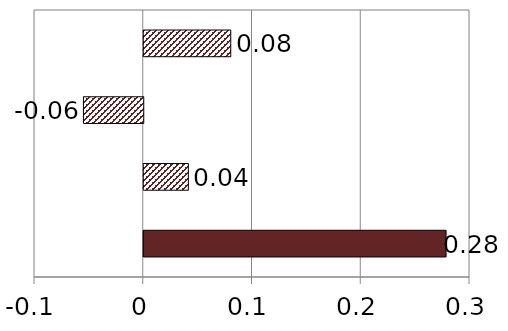
| Category | Series 0 |
|---|---|
| Wage rate | 0.278 |
| Hours worked | 0.041 |
| Employment rate | -0.055 |
| Unemployment rate | 0.08 |